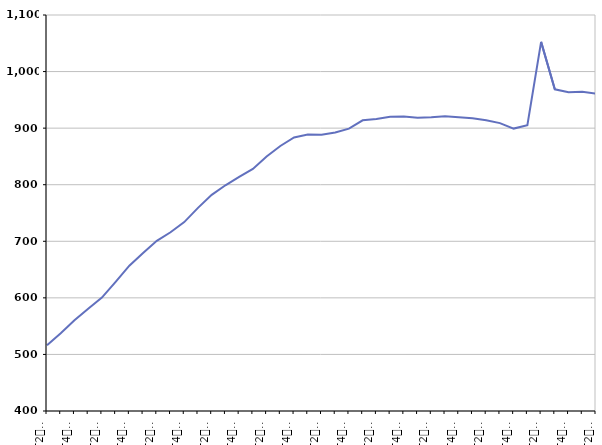
| Category | 50 ans ou plus |
|---|---|
| T2
2011 | 516.3 |
| T3
2011 | 537.6 |
| T4
2011 | 560.4 |
| T1
2012 | 580.9 |
| T2
2012 | 600.4 |
| T3
2012 | 628.3 |
| T4
2012 | 656.8 |
| T1
2013 | 679.2 |
| T2
2013 | 700.9 |
| T3
2013 | 715.9 |
| T4
2013 | 733.9 |
| T1
2014 | 759.1 |
| T2
2014 | 782.1 |
| T3
2014 | 799 |
| T4
2014 | 813.8 |
| T1
2015 | 827.9 |
| T2
2015 | 849.8 |
| T3
2015 | 868.5 |
| T4
2015 | 883.6 |
| T1
2016 | 888.6 |
| T2
2016 | 888.3 |
| T3
2016 | 892.2 |
| T4
2016 | 899.2 |
| T1
2017 | 913.8 |
| T2
2017 | 916.2 |
| T3
2017 | 920 |
| T4
2017 | 920.7 |
| T1
2018 | 918.4 |
| T2
2018 | 919.2 |
| T3
2018 | 921.1 |
| T4
2018 | 919.4 |
| T1
2019 | 917.6 |
| T2
2019 | 913.9 |
| T3
2019 | 908.9 |
| T4
2019 | 899.2 |
| T1
2020 | 905.2 |
| T2
2020 | 1052.5 |
| T3
2020 | 968.7 |
| T4
2020 | 963.3 |
| T1
2021 | 964.2 |
| T2
2021 | 961.2 |